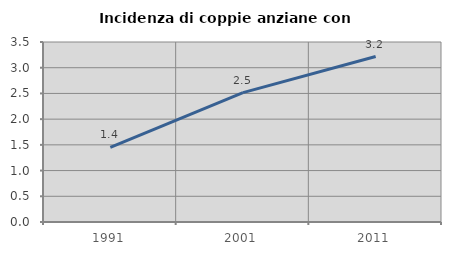
| Category | Incidenza di coppie anziane con figli |
|---|---|
| 1991.0 | 1.449 |
| 2001.0 | 2.516 |
| 2011.0 | 3.217 |